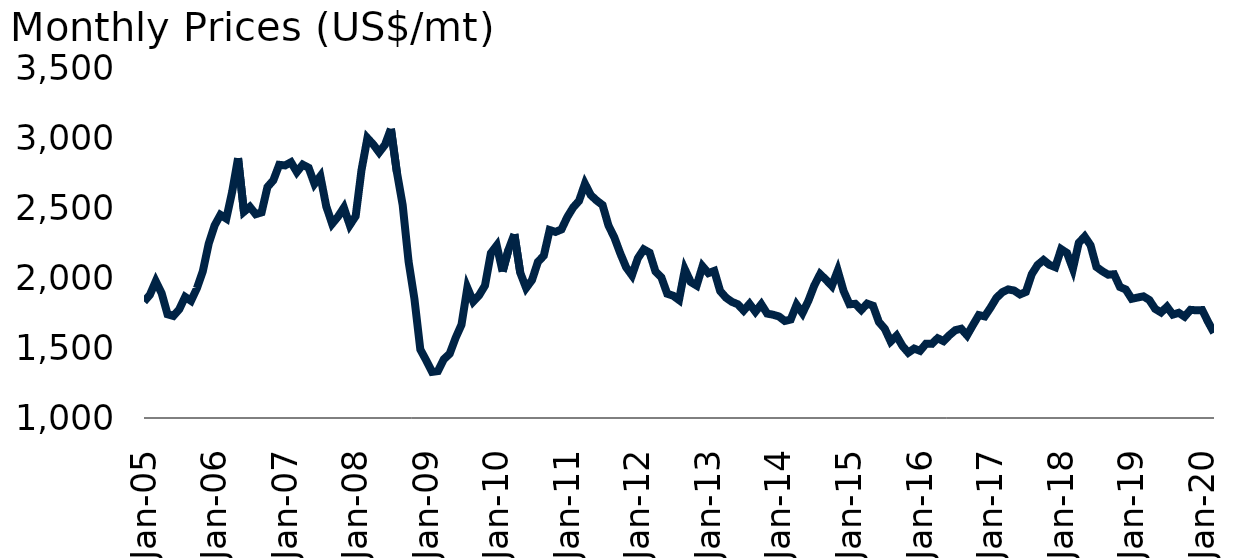
| Category | Aluminum |
|---|---|
| 2005-01-01 | 1834.425 |
| 2005-02-01 | 1882.85 |
| 2005-03-01 | 1979.85 |
| 2005-04-01 | 1894.286 |
| 2005-05-01 | 1743.7 |
| 2005-06-01 | 1731.295 |
| 2005-07-01 | 1778.786 |
| 2005-08-01 | 1867.841 |
| 2005-09-01 | 1839.909 |
| 2005-10-01 | 1928.714 |
| 2005-11-01 | 2050.591 |
| 2005-12-01 | 2247.45 |
| 2006-01-01 | 2377.857 |
| 2006-02-01 | 2455.325 |
| 2006-03-01 | 2429.13 |
| 2006-04-01 | 2621.111 |
| 2006-05-01 | 2861.476 |
| 2006-06-01 | 2477.341 |
| 2006-07-01 | 2512.714 |
| 2006-08-01 | 2459.932 |
| 2006-09-01 | 2472.881 |
| 2006-10-01 | 2654.591 |
| 2006-11-01 | 2702.795 |
| 2006-12-01 | 2813.632 |
| 2007-01-01 | 2809.341 |
| 2007-02-01 | 2832.2 |
| 2007-03-01 | 2761.727 |
| 2007-04-01 | 2814.789 |
| 2007-05-01 | 2792.75 |
| 2007-06-01 | 2676.93 |
| 2007-07-01 | 2732.44 |
| 2007-08-01 | 2515.773 |
| 2007-09-01 | 2391.25 |
| 2007-10-01 | 2442.37 |
| 2007-11-01 | 2506.886 |
| 2007-12-01 | 2381.694 |
| 2008-01-01 | 2445.523 |
| 2008-02-01 | 2776.929 |
| 2008-03-01 | 3005.289 |
| 2008-04-01 | 2959.273 |
| 2008-05-01 | 2902.9 |
| 2008-06-01 | 2957.857 |
| 2008-07-01 | 3071.239 |
| 2008-08-01 | 2764.375 |
| 2008-09-01 | 2525.818 |
| 2008-10-01 | 2121.413 |
| 2008-11-01 | 1852.425 |
| 2008-12-01 | 1490.429 |
| 2009-01-01 | 1413.119 |
| 2009-02-01 | 1330.2 |
| 2009-03-01 | 1335.841 |
| 2009-04-01 | 1420.85 |
| 2009-05-01 | 1460.447 |
| 2009-06-01 | 1573.727 |
| 2009-07-01 | 1667.957 |
| 2009-08-01 | 1933.75 |
| 2009-09-01 | 1834.114 |
| 2009-10-01 | 1878.568 |
| 2009-11-01 | 1949.286 |
| 2009-12-01 | 2180.095 |
| 2010-01-01 | 2235.15 |
| 2010-02-01 | 2048.925 |
| 2010-03-01 | 2205.63 |
| 2010-04-01 | 2316.725 |
| 2010-05-01 | 2040.526 |
| 2010-06-01 | 1931.386 |
| 2010-07-01 | 1988.273 |
| 2010-08-01 | 2118.143 |
| 2010-09-01 | 2162.341 |
| 2010-10-01 | 2346.57 |
| 2010-11-01 | 2333.068 |
| 2010-12-01 | 2350.667 |
| 2011-01-01 | 2439.525 |
| 2011-02-01 | 2508.175 |
| 2011-03-01 | 2555.5 |
| 2011-04-01 | 2678.11 |
| 2011-05-01 | 2596.45 |
| 2011-06-01 | 2557.76 |
| 2011-07-01 | 2525.43 |
| 2011-08-01 | 2379.35 |
| 2011-09-01 | 2293.46 |
| 2011-10-01 | 2180.65 |
| 2011-11-01 | 2079.98 |
| 2011-12-01 | 2022.25 |
| 2012-01-01 | 2144.2 |
| 2012-02-01 | 2207.92 |
| 2012-03-01 | 2184.16 |
| 2012-04-01 | 2049.67 |
| 2012-05-01 | 2007.631 |
| 2012-06-01 | 1890.179 |
| 2012-07-01 | 1876.25 |
| 2012-08-01 | 1845.376 |
| 2012-09-01 | 2064.12 |
| 2012-10-01 | 1974.3 |
| 2012-11-01 | 1948.83 |
| 2012-12-01 | 2086.763 |
| 2013-01-01 | 2037.75 |
| 2013-02-01 | 2053.595 |
| 2013-03-01 | 1909.567 |
| 2013-04-01 | 1861.67 |
| 2013-05-01 | 1832.022 |
| 2013-06-01 | 1814.538 |
| 2013-07-01 | 1769.609 |
| 2013-08-01 | 1817.616 |
| 2013-09-01 | 1761.305 |
| 2013-10-01 | 1814.583 |
| 2013-11-01 | 1747.964 |
| 2013-12-01 | 1739.81 |
| 2014-01-01 | 1727.41 |
| 2014-02-01 | 1695.17 |
| 2014-03-01 | 1705.37 |
| 2014-04-01 | 1810.67 |
| 2014-05-01 | 1751.05 |
| 2014-06-01 | 1838.95 |
| 2014-07-01 | 1948.3 |
| 2014-08-01 | 2030.49 |
| 2014-09-01 | 1990.43 |
| 2014-10-01 | 1946.19 |
| 2014-11-01 | 2055.55 |
| 2014-12-01 | 1909.46 |
| 2015-01-01 | 1814.72 |
| 2015-02-01 | 1817.82 |
| 2015-03-01 | 1773.86 |
| 2015-04-01 | 1819.19 |
| 2015-05-01 | 1804.04 |
| 2015-06-01 | 1687.73 |
| 2015-07-01 | 1639.5 |
| 2015-08-01 | 1548.13 |
| 2015-09-01 | 1589.6 |
| 2015-10-01 | 1516.49 |
| 2015-11-01 | 1467.89 |
| 2015-12-01 | 1497.2 |
| 2016-01-01 | 1481.1 |
| 2016-02-01 | 1531.26 |
| 2016-03-01 | 1531.01 |
| 2016-04-01 | 1571.23 |
| 2016-05-01 | 1550.63 |
| 2016-06-01 | 1593.51 |
| 2016-07-01 | 1629.05 |
| 2016-08-01 | 1639.28 |
| 2016-09-01 | 1592.36 |
| 2016-10-01 | 1665.9 |
| 2016-11-01 | 1737.11 |
| 2016-12-01 | 1727.74 |
| 2017-01-01 | 1791.24 |
| 2017-02-01 | 1860.75 |
| 2017-03-01 | 1901.47 |
| 2017-04-01 | 1921.22 |
| 2017-05-01 | 1913.02 |
| 2017-06-01 | 1885.29 |
| 2017-07-01 | 1902.96 |
| 2017-08-01 | 2030.01 |
| 2017-09-01 | 2096.49 |
| 2017-10-01 | 2131.49 |
| 2017-11-01 | 2097.44 |
| 2017-12-01 | 2080.47 |
| 2018-01-01 | 2209.73 |
| 2018-02-01 | 2181.79 |
| 2018-03-01 | 2069.24 |
| 2018-04-01 | 2254.69 |
| 2018-05-01 | 2299.67 |
| 2018-06-01 | 2237.62 |
| 2018-07-01 | 2082.24 |
| 2018-08-01 | 2051.51 |
| 2018-09-01 | 2026.46 |
| 2018-10-01 | 2029.86 |
| 2018-11-01 | 1938.51 |
| 2018-12-01 | 1920.38 |
| 2019-01-01 | 1853.72 |
| 2019-02-01 | 1862.99 |
| 2019-03-01 | 1871.21 |
| 2019-04-01 | 1845.42 |
| 2019-05-01 | 1781.26 |
| 2019-06-01 | 1755.95 |
| 2019-07-01 | 1796.99 |
| 2019-08-01 | 1740.68 |
| 2019-09-01 | 1753.51 |
| 2019-10-01 | 1725.96 |
| 2019-11-01 | 1774.79 |
| 2019-12-01 | 1771.38 |
| 2020-01-01 | 1773.09 |
| 2020-02-01 | 1688.1 |
| 2020-03-01 | 1610.89 |